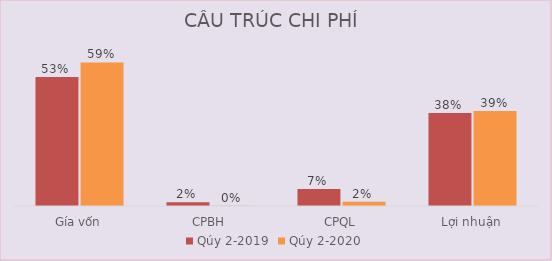
| Category | Qúy 2-2019 | Qúy 2-2020 |
|---|---|---|
| Gía vốn | 0.532 | 0.591 |
| CPBH | 0.015 | 0.001 |
| CPQL | 0.07 | 0.017 |
| Lợi nhuận | 0.383 | 0.391 |